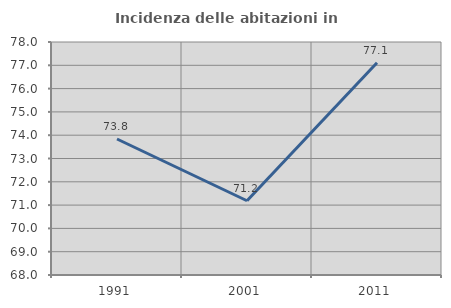
| Category | Incidenza delle abitazioni in proprietà  |
|---|---|
| 1991.0 | 73.837 |
| 2001.0 | 71.186 |
| 2011.0 | 77.108 |